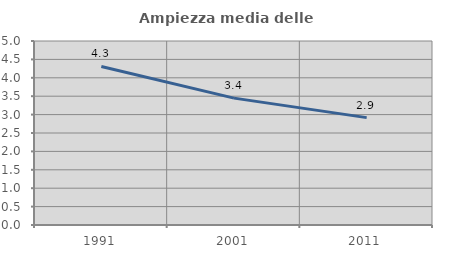
| Category | Ampiezza media delle famiglie |
|---|---|
| 1991.0 | 4.307 |
| 2001.0 | 3.447 |
| 2011.0 | 2.918 |